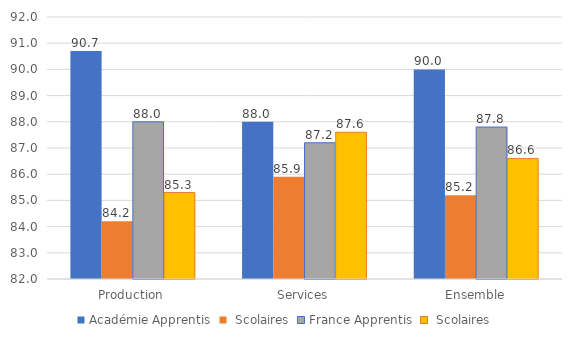
| Category | Académie | France |
|---|---|---|
| Production | 84.2 | 85.3 |
| Services | 85.9 | 87.6 |
| Ensemble | 85.2 | 86.6 |